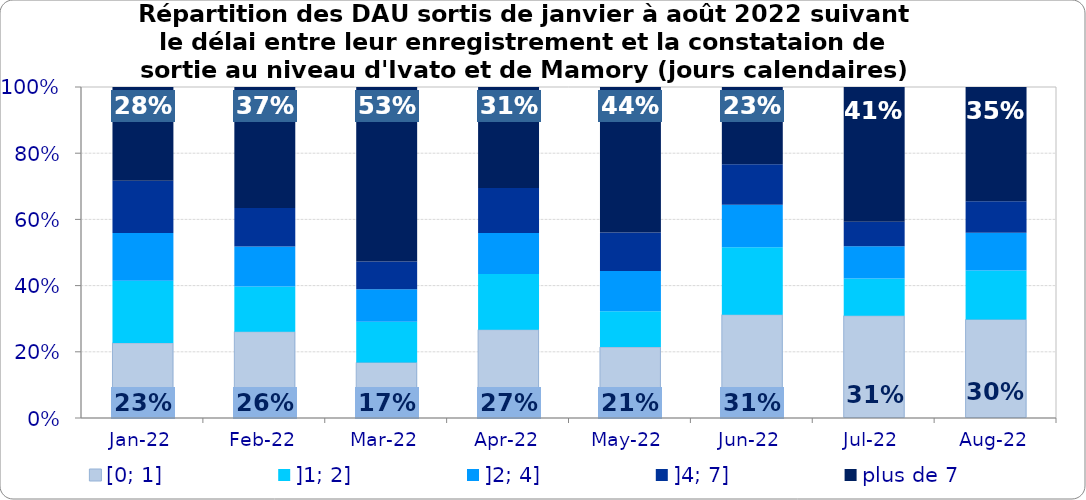
| Category | [0; 1] | ]1; 2] | ]2; 4] | ]4; 7] | plus de 7 |
|---|---|---|---|---|---|
| 2022-01-01 | 0.227 | 0.188 | 0.145 | 0.158 | 0.283 |
| 2022-02-01 | 0.261 | 0.136 | 0.121 | 0.116 | 0.366 |
| 2022-03-01 | 0.168 | 0.123 | 0.098 | 0.083 | 0.527 |
| 2022-04-01 | 0.267 | 0.169 | 0.123 | 0.136 | 0.305 |
| 2022-05-01 | 0.214 | 0.108 | 0.122 | 0.116 | 0.44 |
| 2022-06-01 | 0.312 | 0.203 | 0.129 | 0.122 | 0.233 |
| 2022-07-01 | 0.309 | 0.112 | 0.098 | 0.074 | 0.407 |
| 2022-08-01 | 0.298 | 0.148 | 0.114 | 0.095 | 0.345 |